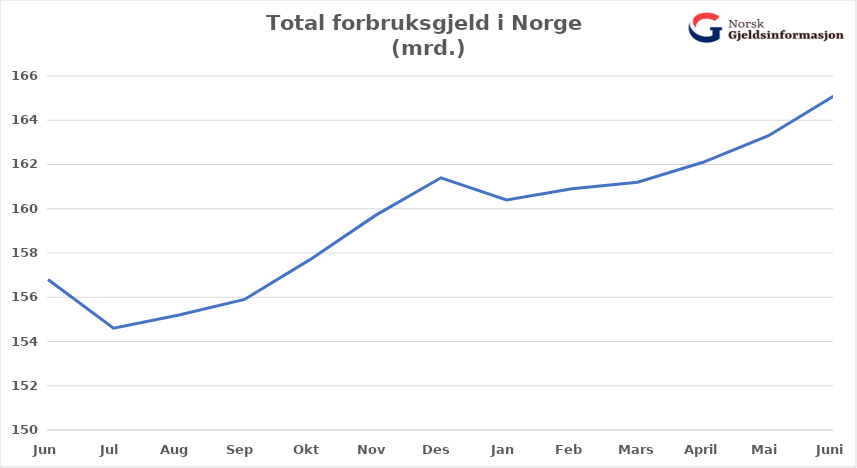
| Category | Total usikret gjeld (mrd) |
|---|---|
| Jun | 156.8 |
| Jul | 154.6 |
| Aug | 155.2 |
| Sep | 155.9 |
| Okt | 157.7 |
| Nov | 159.7 |
| Des | 161.4 |
| Jan | 160.4 |
| Feb | 160.9 |
| Mars | 161.2 |
| April | 162.1 |
| Mai | 163.3 |
| Juni | 165.1 |